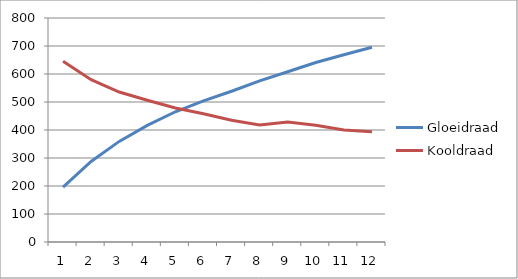
| Category | Gloeidraad | Kooldraad |
|---|---|---|
| 0 | 196.078 | 645.161 |
| 1 | 287.77 | 579.71 |
| 2 | 359.281 | 535.714 |
| 3 | 416.667 | 506.329 |
| 4 | 465.116 | 478.469 |
| 5 | 504.202 | 458.015 |
| 6 | 538.462 | 434.783 |
| 7 | 575.54 | 417.755 |
| 8 | 608.108 | 428.571 |
| 9 | 641.026 | 416.667 |
| 10 | 668.693 | 400 |
| 11 | 695.652 | 393.443 |